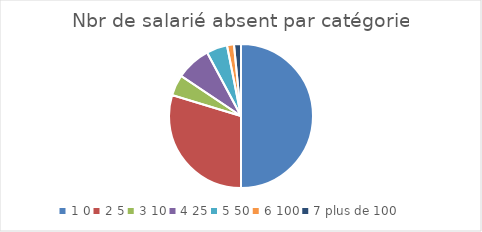
| Category | Nbr de salarié absent par catégorie |
|---|---|
| 0 | 32 |
| 1 | 19 |
| 2 | 3 |
| 3 | 5 |
| 4 | 3 |
| 5 | 1 |
| 6 | 1 |